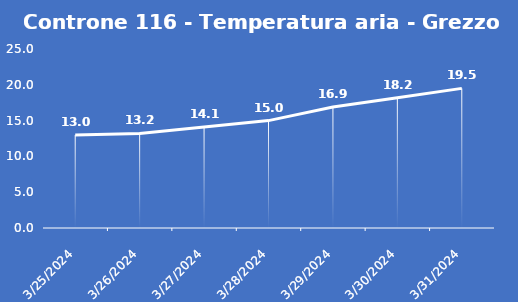
| Category | Controne 116 - Temperatura aria - Grezzo (°C) |
|---|---|
| 3/25/24 | 13 |
| 3/26/24 | 13.2 |
| 3/27/24 | 14.1 |
| 3/28/24 | 15 |
| 3/29/24 | 16.9 |
| 3/30/24 | 18.2 |
| 3/31/24 | 19.5 |